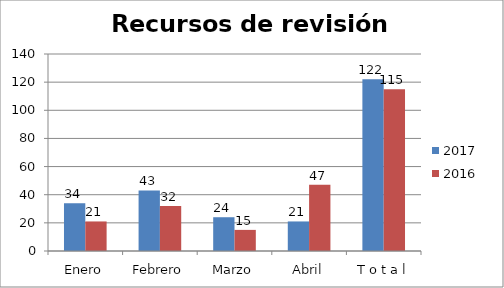
| Category | 2017 | 2016 |
|---|---|---|
| Enero | 34 | 21 |
| Febrero | 43 | 32 |
| Marzo | 24 | 15 |
| Abril | 21 | 47 |
| T o t a l | 122 | 115 |